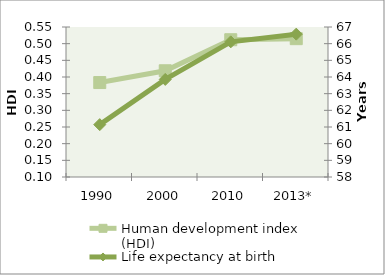
| Category | Human development index (HDI) |
|---|---|
| 1990 | 0.383 |
| 2000 | 0.419 |
| 2010 | 0.512 |
| 2013* | 0.515 |